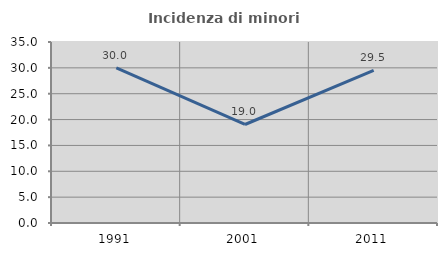
| Category | Incidenza di minori stranieri |
|---|---|
| 1991.0 | 30 |
| 2001.0 | 19.048 |
| 2011.0 | 29.508 |